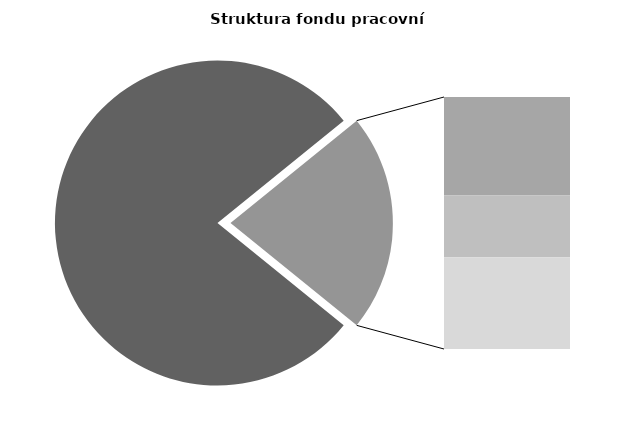
| Category | Series 0 |
|---|---|
| Průměrná měsíční odpracovaná doba bez přesčasu | 133.123 |
| Dovolená | 14.406 |
| Nemoc | 9.035 |
| Jiné | 13.44 |